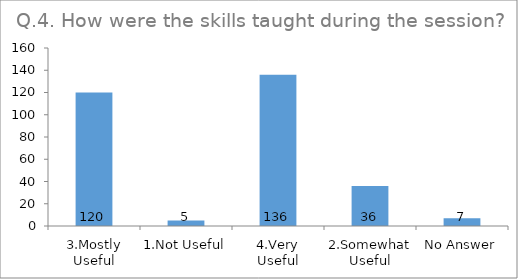
| Category | Q.4. How were the skills taught during the session? |
|---|---|
| 3.Mostly Useful | 120 |
| 1.Not Useful | 5 |
| 4.Very Useful | 136 |
| 2.Somewhat Useful | 36 |
| No Answer | 7 |